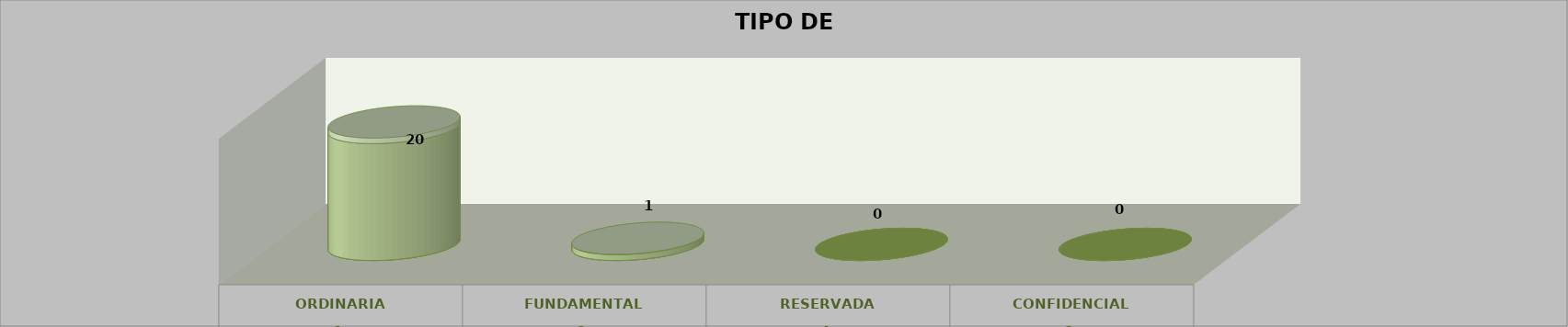
| Category | Series 0 | Series 2 | Series 1 | Series 3 | Series 4 |
|---|---|---|---|---|---|
| 0 |  |  |  | 20 | 0.952 |
| 1 |  |  |  | 1 | 0.048 |
| 2 |  |  |  | 0 | 0 |
| 3 |  |  |  | 0 | 0 |